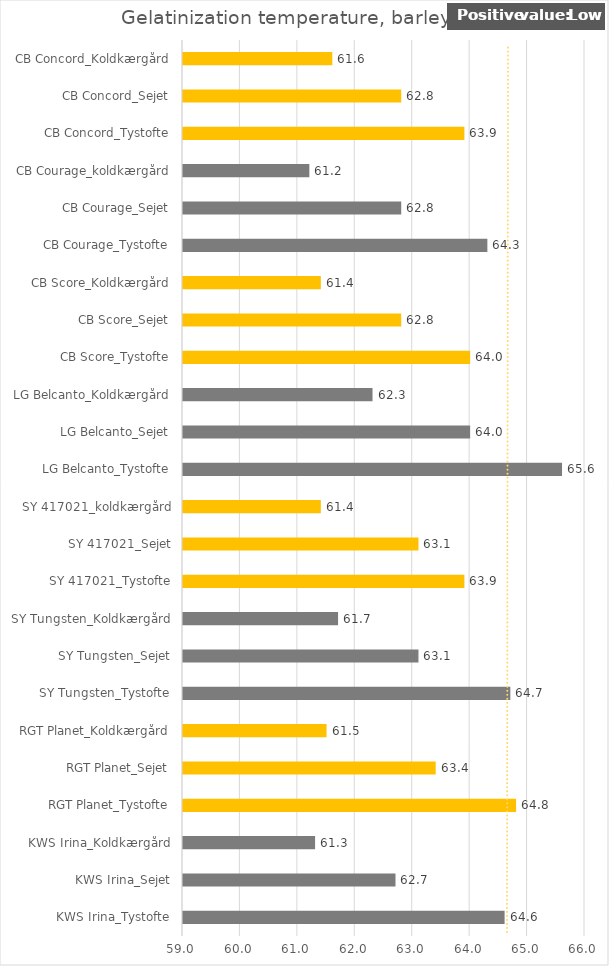
| Category |   Gelatinization temperature, barley [°C ] |
|---|---|
| KWS Irina_Tystofte | 64.6 |
| KWS Irina_Sejet | 62.7 |
| KWS Irina_Koldkærgård | 61.3 |
| RGT Planet_Tystofte | 64.8 |
| RGT Planet_Sejet | 63.4 |
| RGT Planet_Koldkærgård | 61.5 |
| SY Tungsten_Tystofte | 64.7 |
| SY Tungsten_Sejet | 63.1 |
| SY Tungsten_Koldkærgård | 61.7 |
| SY 417021_Tystofte | 63.9 |
| SY 417021_Sejet | 63.1 |
| SY 417021_koldkærgård | 61.4 |
| LG Belcanto_Tystofte | 65.6 |
| LG Belcanto_Sejet | 64 |
| LG Belcanto_Koldkærgård | 62.3 |
| CB Score_Tystofte | 64 |
| CB Score_Sejet | 62.8 |
| CB Score_Koldkærgård | 61.4 |
| CB Courage_Tystofte | 64.3 |
| CB Courage_Sejet | 62.8 |
| CB Courage_koldkærgård | 61.2 |
| CB Concord_Tystofte | 63.9 |
| CB Concord_Sejet | 62.8 |
| CB Concord_Koldkærgård | 61.6 |